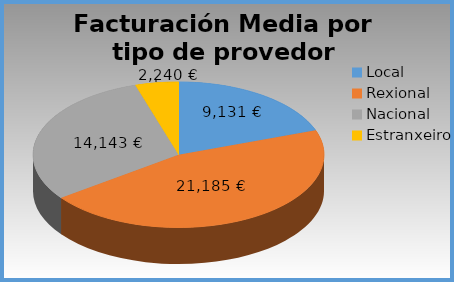
| Category | Facturación Media por tipo de provedor |
|---|---|
| Local | 9130.531 |
| Rexional | 21184.81 |
| Nacional | 14142.565 |
| Estranxeiro | 2239.517 |